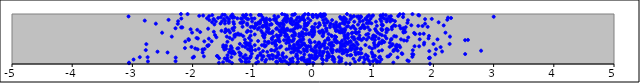
| Category | points |
|---|---|
| 0.28631237360216133 | 0.413 |
| -0.5709670232004376 | 0.495 |
| -2.3455216637890155 | 0.548 |
| -0.5499828507902489 | 0.104 |
| 0.6344324026478905 | 0.179 |
| 1.135706288979729 | 0.852 |
| 1.4372722017462278 | 0.762 |
| -0.4767321881819129 | 0.632 |
| -0.42278632323329113 | 0.451 |
| 1.30479831486943 | 0.502 |
| -0.5423704332218904 | 0.638 |
| -1.0743103809468266 | 0.895 |
| 0.9093813845658696 | 0.735 |
| 0.4461499582376689 | 0.796 |
| 0.3174532839278532 | 0.877 |
| 0.18317735786781153 | 0.365 |
| 0.06883051844332666 | 0.38 |
| 0.700314994260216 | 0.235 |
| -1.8058682499574052 | 0.453 |
| -0.1724643142331237 | 0.937 |
| -0.06916244388780779 | 0.026 |
| -0.5365765248501049 | 0.066 |
| -0.22979342127274993 | 0.601 |
| 0.19696704255364672 | 0.459 |
| 1.4420515253011414 | 0.995 |
| -1.4656345420582095 | 0.981 |
| 1.0607852612586992 | 0.764 |
| -0.3173891089680838 | 0.636 |
| 0.447472624164412 | 0.07 |
| -1.0947298749557612 | 0.81 |
| -1.0140542113659192 | 0.279 |
| -0.638083960201242 | 0.266 |
| 1.6577859305472735 | 0.275 |
| -0.3681614701345337 | 0.816 |
| 0.2915248789625249 | 0.38 |
| -1.0613637014224135 | 0.41 |
| -1.6135907318958669 | 0.85 |
| -1.3093623990409373 | 0.211 |
| 1.5013714261222342 | 0.651 |
| -0.9185939609505382 | 0.696 |
| -1.2104163992287207 | 0.172 |
| 2.5283634539804094 | 0.199 |
| -1.0524070766473645 | 0.408 |
| 1.0002923353349606 | 0.556 |
| -0.3014528794329543 | 0.708 |
| -0.16595293698929137 | 0.922 |
| 0.6650741115798908 | 0.758 |
| 1.28651173208838 | 0.192 |
| -0.9685784449776893 | 0.377 |
| -0.7378115214331746 | 0.707 |
| -0.20033730462058585 | 0.58 |
| 0.40974114238819936 | 0.67 |
| -0.6597229061424814 | 0.548 |
| -1.4427862025825364 | 0.305 |
| -0.13526549446516967 | 0.81 |
| 0.47180004164708667 | 0.108 |
| -0.045270741931597414 | 0.349 |
| 1.1481751497962644 | 0.686 |
| 0.5280723621406853 | 0.915 |
| -0.2060441158924311 | 0.347 |
| -1.3171111232605828 | 0.234 |
| -0.9244083371875433 | 0.796 |
| -0.3823866680530488 | 0.361 |
| -1.3502675074652828 | 0.322 |
| 0.827576718456271 | 0.863 |
| 0.6854094799217707 | 0.491 |
| -0.5136678156327177 | 0.998 |
| 1.8390853826058429 | 0.605 |
| -2.8773133847457757 | 0.137 |
| 1.2473095647619088 | 0.687 |
| 0.10240273423950352 | 0.423 |
| -1.3926207020137173 | 0.238 |
| 1.4614444659623516 | 0.493 |
| 0.25807453091606636 | 0.601 |
| -0.8372305807208802 | 0.758 |
| -0.8281933356508944 | 0.752 |
| -2.794580890276049 | 0.868 |
| -0.13900485390203254 | 0.767 |
| 0.783415549932899 | 0.942 |
| -0.18273974006321048 | 0.637 |
| -0.346224884974597 | 0.566 |
| -0.07964475199217347 | 0.816 |
| 0.4914757870452515 | 0.689 |
| 1.649374466103728 | 0.199 |
| -0.9671200633866457 | 0.591 |
| -1.4280327907212795 | 0.931 |
| -0.9631924948197206 | 0.744 |
| -1.584802740413652 | 0.155 |
| 3.001768790963995 | 0.945 |
| -1.5360781472547957 | 0.81 |
| -0.9544577010922701 | 0.811 |
| -1.5581121113269916 | 0.116 |
| 0.6883966439386597 | 0.498 |
| -0.10186170962075725 | 0.778 |
| -0.5713076849667127 | 0.191 |
| 0.833925490452053 | 0.782 |
| 1.5327451708922117 | 0.641 |
| -2.284270209862583 | 0.715 |
| -0.3132790501727847 | 0.386 |
| -3.055993340217732 | 0.026 |
| -0.026014965633065934 | 0.648 |
| -0.44283979954539365 | 0.419 |
| -0.23881592092844173 | 0.341 |
| -0.6139196445807933 | 0.854 |
| 0.9113013311058253 | 0.152 |
| 0.1959636397571094 | 0.769 |
| -2.7683834535698306 | 0.397 |
| 1.158320062868512 | 0.769 |
| 0.9319616235447512 | 0.062 |
| -0.25064880169868164 | 0.777 |
| -0.8298473386451448 | 0.257 |
| -1.0373644174137961 | 0.565 |
| 0.38125053152281474 | 0.66 |
| 0.36822699099341527 | 0.446 |
| 0.45467639047289143 | 0.631 |
| -1.1171292754346096 | 0.416 |
| -0.254991188271104 | 0.726 |
| 0.5074935426260261 | 0.407 |
| -0.6047053249857948 | 0.304 |
| 0.2025968549814463 | 0.309 |
| -0.18818910459752214 | 0.111 |
| -2.1712136349292583 | 0.733 |
| -0.10881605551854356 | 0.77 |
| -1.8331795761894725 | 0.23 |
| -0.055845184771494694 | 0.054 |
| -0.8136604030634356 | 0.383 |
| -2.5827312670867975 | 0.246 |
| -0.6014156195161053 | 0.823 |
| 0.890498851229772 | 0.816 |
| 0.9176585795064742 | 0.603 |
| 1.4163063164377565 | 0.959 |
| 0.4910942369720459 | 0.267 |
| 0.534032341111911 | 0.684 |
| -0.8498209591245818 | 0.376 |
| -1.022243545271082 | 0.332 |
| 1.819074424757119 | 0.759 |
| -0.44905680283906246 | 0.846 |
| 0.06282551770594758 | 0.146 |
| -0.33372817681970535 | 0.56 |
| 0.2841898879890339 | 0.736 |
| -0.16116325533000175 | 0.493 |
| -1.3783475916697485 | 0.63 |
| -0.48255971421439003 | 0.676 |
| 1.666885294946626 | 0.19 |
| 1.223352967142021 | 0.849 |
| 0.39536076353366223 | 0.427 |
| -0.214246253179045 | 0.48 |
| 1.5193403580270024 | 0.685 |
| 0.35426109291032226 | 0.095 |
| -0.49510940768877454 | 0.866 |
| 0.13009788510700293 | 0.342 |
| -0.6022129149119477 | 0.717 |
| 0.5816129568028678 | 0.517 |
| -0.004355514641864566 | 0.652 |
| -1.2572905455128387 | 0.309 |
| -0.24529664574777854 | 0.446 |
| 1.0625892519119784 | 0.032 |
| -0.8105559740982731 | 0.54 |
| 2.791789605335289 | 0.266 |
| -0.6112121678142817 | 0.46 |
| 0.58359937561519 | 0.268 |
| -1.066085860212743 | 0.373 |
| -0.1132113498187639 | 0.357 |
| -1.4531315827806255 | 0.347 |
| 1.0736669701711232 | 0.625 |
| -2.127301444714845 | 0.318 |
| -0.5750587598583365 | 0.512 |
| -1.3193038765241756 | 0.673 |
| 0.8628779148367833 | 0.087 |
| -1.873689761123762 | 0.639 |
| 1.9427425975114954 | 0.005 |
| 0.28278404833308635 | 0.772 |
| 0.09114233559514862 | 0.964 |
| -0.6776628486168077 | 0.417 |
| 1.1694065488313639 | 0.451 |
| 0.2623287522462485 | 0.486 |
| 0.2396981247990464 | 0.236 |
| 0.65632640850703 | 0.317 |
| -0.509432843419769 | 0.171 |
| 1.9722331279038476 | 0.902 |
| -1.604946100021226 | 0.535 |
| -0.6690230244893609 | 0.651 |
| -1.5634019972580617 | 0.024 |
| 0.676883195285626 | 0.377 |
| 0.15621033467665058 | 0.972 |
| 0.9258261179296383 | 0.818 |
| 0.8284131488541231 | 0.762 |
| 1.3057640147110172 | 0.369 |
| -0.8312361935550197 | 0.567 |
| -0.40792683965000087 | 0.485 |
| 0.0375187267795285 | 0.803 |
| 0.5787725006376405 | 0.404 |
| -0.14083327196879925 | 0.876 |
| 0.5263252581691802 | 0.579 |
| 0.402731034050686 | 0.446 |
| 0.004261547775881169 | 0.262 |
| 0.1578162587894072 | 0.974 |
| 1.0219721068639211 | 0.381 |
| 0.6419607279943689 | 0.616 |
| 0.018378548775983994 | 0.628 |
| -0.7748696374755264 | 0.871 |
| 0.8423940961458616 | 0.027 |
| -2.061200208596601 | 0.481 |
| -0.12516790556005386 | 0.598 |
| -1.9340497753061587 | 0.521 |
| -0.8971336368484533 | 0.979 |
| -2.068029504007132 | 0.498 |
| 0.98847511820113 | 0.194 |
| -0.8736513864199784 | 0.216 |
| 0.43109505488992994 | 0.135 |
| 0.14535947702331242 | 0.941 |
| -0.34835845164455925 | 0.311 |
| -0.8357606128194748 | 0.932 |
| 0.11278463866858246 | 0.78 |
| -0.43620746595386173 | 0.848 |
| -1.3553421974142879 | 0.139 |
| -0.2502480303630197 | 0.043 |
| -1.1704117173995332 | 0.745 |
| 0.06834471916642659 | 0.148 |
| -1.3620574064284714 | 0.226 |
| -0.46861322610025535 | 0.905 |
| 0.05007533915311235 | 0.98 |
| -0.12779374363962148 | 0.701 |
| -0.6321328984466819 | 0.899 |
| -1.0319072811139858 | 0.651 |
| -0.3746523367788628 | 0.832 |
| 0.7851005180602009 | 0.212 |
| -0.7339076317224631 | 0.624 |
| 0.5411884253240133 | 0.522 |
| 1.1547194575676514 | 0.783 |
| 0.4894580778647004 | 0.629 |
| 1.164357419516632 | 0.987 |
| -0.41966949920777274 | 0.91 |
| -1.3791252037594655 | 0.29 |
| 0.021346387678622847 | 0.645 |
| -1.1620196342410978 | 0.137 |
| -0.44019847661373834 | 0.294 |
| -1.8361426774921243 | 0.291 |
| 0.8058050486637178 | 0.477 |
| -1.4728753927524947 | 0.289 |
| -0.2027367161335203 | 0.231 |
| -1.4615456418629575 | 0.637 |
| 1.3360453195106254 | 0.259 |
| 0.43482715054916365 | 0.035 |
| 0.728898152056046 | 0.32 |
| -1.0370010144026978 | 0.74 |
| 0.9040213347936348 | 0.106 |
| -1.0070560105136206 | 0.748 |
| 1.1854065742702895 | 0.907 |
| -1.389015204092587 | 0.054 |
| -0.06325880042214926 | 0.595 |
| -0.7693129112122579 | 0.648 |
| -0.8812384707899836 | 0.81 |
| -1.1525198214496157 | 0.841 |
| -1.4305576678747585 | 0.1 |
| -1.130567962184581 | 0.932 |
| 1.2190825267579983 | 0.634 |
| 0.3633789925427946 | 0.555 |
| 0.34020136916582544 | 0.13 |
| -1.463332083400143 | 0.811 |
| 1.3872488154649494 | 0.33 |
| -0.8670967217569965 | 0.871 |
| 0.9801310343893244 | 0.953 |
| -0.5096618785204798 | 0.05 |
| 0.6493301640077798 | 0.933 |
| -0.012759899399733321 | 0.975 |
| -0.6212457131848286 | 0.36 |
| 1.5678019472052913 | 0.072 |
| 0.16328360637596173 | 0.238 |
| 2.2422271162922893 | 0.926 |
| -1.258747883679587 | 0.592 |
| 1.861924247803345 | 0.897 |
| -0.08549589323840312 | 0.815 |
| -1.319279022232184 | 0.94 |
| 0.7427133301706599 | 0.391 |
| -0.06691371071583951 | 0.078 |
| -0.22824384243352558 | 0.933 |
| 0.10197771542425649 | 0.416 |
| 0.7946210133311871 | 0.952 |
| -0.9749520610376523 | 0.72 |
| -0.7156591095137621 | 0.11 |
| -1.423100966429689 | 0.122 |
| 0.9379116200174797 | 0.335 |
| -0.07429976347279066 | 0.355 |
| 0.5699192435396787 | 0.177 |
| -0.9346931171327695 | 0.12 |
| 0.6557976637737362 | 0.624 |
| 0.06855100923734891 | 0.931 |
| 1.294030501499309 | 0.483 |
| -0.40384721150335334 | 0.005 |
| -1.6451121789338572 | 0.889 |
| -0.8304672414838059 | 0.899 |
| -0.45060245762720186 | 0.875 |
| 0.5015357595644074 | 0.279 |
| -1.0922878816460733 | 0.783 |
| 1.2866440533697467 | 0.897 |
| -0.9716325949332036 | 0.911 |
| -0.34348697176845455 | 0.982 |
| -0.7414989538019823 | 0.418 |
| -0.15768320761441856 | 0.133 |
| 1.310135653325342 | 0.696 |
| -1.574994961874939 | 0.921 |
| -1.955577782606488 | 0.31 |
| 1.2355307230187123 | 0.888 |
| -0.5596464153152585 | 0.783 |
| -0.4113038048071891 | 0.479 |
| -1.440833773394326 | 0.661 |
| 0.03405481684917788 | 0.329 |
| -0.335042108131141 | 0.683 |
| -0.5386702659912128 | 0.082 |
| -0.9105602691948276 | 0.044 |
| -1.3127890316123976 | 0.801 |
| 1.4745147504387681 | 0.214 |
| 0.9708191346079813 | 0.813 |
| 0.2515823988471544 | 0.518 |
| -1.8245860191527958 | 0.969 |
| -1.2253046485449008 | 0.232 |
| 0.48871317332888164 | 0.212 |
| -0.6411759606394156 | 0.96 |
| -0.7272969067672133 | 0.165 |
| -1.1041835111651235 | 0.422 |
| 0.29122032516372265 | 0.809 |
| -0.9114592408244953 | 0.46 |
| 0.8712414496628966 | 0.379 |
| 1.9319517847529522 | 0.258 |
| 1.1050969458178983 | 0.428 |
| 1.847367631964259 | 0.426 |
| -0.21018292460315813 | 0.555 |
| 0.5534804886400124 | 0.421 |
| -0.5429426939896524 | 0.752 |
| -0.0022581675472324036 | 0.982 |
| -1.3211345546992224 | 0.84 |
| -0.28879886470828886 | 0.731 |
| 0.05528646353333144 | 0.118 |
| -0.839056478829467 | 0.744 |
| 0.3123999740238368 | 0.427 |
| 0.02441207640253129 | 0.125 |
| 1.1961390056824968 | 0.557 |
| -1.6729887441386806 | 0.977 |
| -0.04346636002842974 | 0.87 |
| 2.200465884316337 | 0.626 |
| -0.5942447937720576 | 0.041 |
| 0.04518100873801245 | 0.351 |
| 0.12445538503074793 | 0.996 |
| -0.2092668358242955 | 0.743 |
| -0.7752038330453095 | 0.909 |
| -1.3349581651299864 | 0.259 |
| 0.7525822452276554 | 0.207 |
| 1.5823067464527893 | 0.532 |
| -0.7788829389193133 | 0.085 |
| -0.5629816961988006 | 0.672 |
| 1.842620633737555 | 0.391 |
| -0.5837359919381342 | 0.231 |
| 0.5052368681279908 | 0.879 |
| 0.2250522912918278 | 0.66 |
| -0.30633109224450816 | 0.271 |
| -0.4359037341451497 | 0.032 |
| -1.652031630538911 | 0.898 |
| 0.6764909475055045 | 0.537 |
| -0.7597160823033908 | 0.243 |
| -0.3201918783336488 | 0.849 |
| 1.5040400644369472 | 0.629 |
| 1.4319929512674374 | 0.369 |
| -1.5955148722150776 | 0.161 |
| -1.19642000471781 | 0.909 |
| -0.013823709388802286 | 0.122 |
| -1.3388331996485485 | 0.709 |
| 0.9316616731620275 | 0.857 |
| -0.5362978532119786 | 0.062 |
| -0.29080528460113175 | 0.789 |
| -0.26351435585905847 | 0.394 |
| 0.0031078526155914332 | 0.02 |
| -1.0513709642267441 | 0.302 |
| -0.5914191250502796 | 0.162 |
| -0.8114615746783702 | 0.592 |
| 0.2709977095093823 | 0.157 |
| -1.2112030919769836 | 0.089 |
| -0.14617477180654426 | 0.389 |
| 0.7625048784272481 | 0.221 |
| -0.7742467472976822 | 0.815 |
| 1.0126711053887787 | 0.423 |
| 1.0338130912205834 | 0.089 |
| 0.891444433009263 | 0.489 |
| -0.16696248908174383 | 0.548 |
| 0.018147746539966647 | 0.11 |
| -1.9969589387792146 | 0.127 |
| 1.0276965047780546 | 0.478 |
| 0.5643358453744902 | 0.998 |
| 1.1126856473790783 | 0.146 |
| 0.3370540794062391 | 0.37 |
| -1.0925241890004358 | 0.111 |
| 0.041609088659257054 | 0.212 |
| -1.7264149415314822 | 0.956 |
| 0.7218758279930535 | 0.613 |
| -0.11415946073422756 | 0.039 |
| 1.499319322877767 | 0.995 |
| 0.17417233000779753 | 0.372 |
| 1.0398171803733947 | 0.551 |
| -1.7481887771511584 | 0.36 |
| -0.3167834583927176 | 0.503 |
| 1.496200597882007 | 0.937 |
| 0.14982154132451342 | 0.161 |
| -1.0847049113177079 | 0.665 |
| -1.0980887386598077 | 0.904 |
| 1.5771890964408772 | 0.874 |
| 0.03567516302372287 | 0.1 |
| 0.10730020748408897 | 0.221 |
| -0.6809227072278183 | 0.49 |
| -0.2026585362180917 | 0.474 |
| -0.2982771251573819 | 0.61 |
| -0.05915289374979338 | 0.173 |
| -1.502318809029342 | 0.985 |
| -0.4652226599930769 | 0.907 |
| 0.24001362202974885 | 0.494 |
| 1.374567572938548 | 0.292 |
| 0.30410493333002275 | 0.281 |
| -0.8669791048221951 | 0.183 |
| 0.5611056635541125 | 0.746 |
| -0.07814527594865872 | 0.99 |
| 1.0471386372692537 | 0.666 |
| 1.1844582159863943 | 0.438 |
| 0.468132467757445 | 0.684 |
| 0.9974446793036842 | 0.971 |
| 0.26240599568146106 | 0.14 |
| 0.5611114559866035 | 0.249 |
| -3.0640699303110557 | 0.951 |
| 1.406886564168885 | 0.267 |
| 0.5261648315911112 | 0.504 |
| -0.9058328077081148 | 0.831 |
| 0.8842695532928095 | 0.587 |
| 1.4477898085108372 | 0.335 |
| -0.1827484250591489 | 0.899 |
| -0.037585463206830205 | 0.425 |
| 1.9268873684672236 | 0.562 |
| -0.2539332037752562 | 0.269 |
| 0.32963119773844696 | 0.284 |
| -0.05942069866079169 | 0.021 |
| 2.119558081370961 | 0.338 |
| 0.035049424088986925 | 0.177 |
| 0.9297565219035411 | 0.972 |
| -2.194278807644647 | 0.999 |
| -1.4902414562204038 | 0.374 |
| -0.7351722123942857 | 0.443 |
| -0.8603143520611978 | 0.664 |
| 2.2697535455179843 | 0.401 |
| 0.3236456476717189 | 0.15 |
| 0.30735568425435655 | 0.349 |
| -0.26397187154345225 | 0.165 |
| 0.7570396854863048 | 0.953 |
| 0.2108709638367543 | 0.9 |
| 0.773465781279473 | 0.57 |
| 2.029233450649194 | 0.195 |
| -1.162403200365823 | 0.974 |
| 0.16340127338092714 | 0.556 |
| -0.5540416362318812 | 0.449 |
| -0.37999810690265345 | 0.092 |
| -0.5772096659577786 | 0.949 |
| 1.138589382752226 | 0.415 |
| -1.22638413887835 | 0.586 |
| -0.2580011670085476 | 0.929 |
| -0.3626249237439305 | 0.672 |
| 1.2763740473195773 | 0.425 |
| -0.5219424797281604 | 0.634 |
| -0.5853567659529233 | 0.813 |
| 2.2751960044793176 | 0.548 |
| -0.31084443049243493 | 0.305 |
| 0.11052559370536752 | 0.18 |
| 0.1260973289099363 | 0.966 |
| -0.1904189940274783 | 0.089 |
| -1.040455720819362 | 0.263 |
| -2.4158157109792358 | 0.23 |
| 1.3807612613429834 | 0.55 |
| 0.7931777913389588 | 0.305 |
| -0.49539633043247644 | 0.709 |
| -1.677321262776383 | 0.836 |
| 1.3693800619963605 | 0.762 |
| -0.1521036323349918 | 0.705 |
| -1.4590063019068031 | 0.867 |
| -0.5289712433042109 | 0.353 |
| 1.0939407972303519 | 0.257 |
| 0.7687115503339887 | 0.504 |
| -1.1215849773852593 | 0.177 |
| 1.0878566934003597 | 0.393 |
| -0.3782057426002794 | 0.668 |
| 0.685967881553359 | 0.845 |
| 1.5577060051456861 | 0.468 |
| 1.1228114585709852 | 0.972 |
| 0.26054193349852817 | 0.198 |
| 0.7643320740582258 | 0.081 |
| -0.4918919816361802 | 0.129 |
| 2.1709373693043155 | 0.772 |
| -0.5417119211253167 | 0.662 |
| -0.23167966062720602 | 0.553 |
| -0.7720845486333356 | 0.751 |
| -0.1459369357765734 | 0.875 |
| -0.05675609981895313 | 0.475 |
| -0.4603818388889058 | 0.573 |
| -0.023607478101525636 | 0.169 |
| -1.095909452597871 | 0.385 |
| -0.43952407153997974 | 0.952 |
| -0.5511190494973146 | 0.33 |
| -0.3276044332367869 | 0.471 |
| -0.400569306307645 | 0.424 |
| 0.840376973248973 | 0.512 |
| -1.6384024884724502 | 0.791 |
| 1.3495838630103716 | 0.558 |
| 1.2266315779297479 | 0.898 |
| -0.7998644336677012 | 0.451 |
| -0.06953249848598553 | 0.612 |
| -0.9009604130529558 | 0.305 |
| 2.293622625466071 | 0.92 |
| 0.5434807559356303 | 0.286 |
| 1.8611907482730325 | 0.806 |
| -1.3008515908663547 | 0.545 |
| 1.128468144099684 | 0.954 |
| 2.2314542841386587 | 0.884 |
| -0.6621018137211321 | 0.17 |
| -0.4724760369794234 | 0.066 |
| -1.492037873716459 | 0.338 |
| -1.7419124625433442 | 0.706 |
| 0.5922233323097519 | 0.834 |
| 0.8044889062444502 | 0.215 |
| -0.7833509399529959 | 0.37 |
| -1.7304068382667923 | 0.506 |
| 1.0458878547901493 | 0.846 |
| 1.4578567948465118 | 0.712 |
| -0.4437926997517412 | 0.139 |
| -1.3437864834867845 | 0.218 |
| -0.01652242804233861 | 0.292 |
| 0.1717905970897755 | 0.609 |
| -1.2882778017231535 | 0.592 |
| 0.018865051530918997 | 0.671 |
| 0.3784527320453508 | 0.453 |
| -0.3081325589572481 | 0.331 |
| 1.31996037051037 | 0.879 |
| -0.4271330172154375 | 0.706 |
| -1.1285692344782117 | 0.422 |
| -0.19209116241762914 | 0.435 |
| -1.3940975133709275 | 0.896 |
| 1.0270041783182604 | 0.331 |
| -0.9451788349338752 | 0.783 |
| -1.1831378020116814 | 0.823 |
| -2.2459667810693116 | 0.803 |
| -0.3215057633434979 | 0.983 |
| 1.4993842051663755 | 0.715 |
| 1.7634625029352655 | 0.354 |
| 0.6906388378747854 | 0.36 |
| 0.4034942174070917 | 0.277 |
| -1.8895499514163836 | 0.963 |
| 1.090954731095354 | 0.51 |
| 0.22543359006013564 | 0.074 |
| 0.3120646257478432 | 0.259 |
| -0.5003167265784771 | 0.214 |
| 0.6642612441404694 | 0.385 |
| -1.3857215686509834 | 0.524 |
| -0.10292907718254707 | 0.009 |
| 0.9889435524347565 | 0.51 |
| 0.14635675348510802 | 0.109 |
| 1.0981838106446826 | 0.13 |
| 0.6251702335794542 | 0.364 |
| 1.650456433121927 | 0.144 |
| 0.3419078901664143 | 0.789 |
| -0.4629391844155313 | 0.617 |
| 0.3635131340986506 | 0.508 |
| 0.1961915255878104 | 0.417 |
| -0.8157585892614341 | 0.766 |
| -1.5200596783670601 | 0.664 |
| -0.6172022467568636 | 0.387 |
| 0.5469134336751198 | 0.845 |
| -0.09136409496560027 | 0.083 |
| 0.24011398215957946 | 0.322 |
| -0.3595801126627869 | 0.055 |
| -1.8121999502373578 | 0.153 |
| 1.0048075072158857 | 0.572 |
| -0.4077640519682273 | 0.532 |
| 0.3843036425800319 | 0.832 |
| 0.5916144319111947 | 0.439 |
| -0.6116202337301422 | 0.045 |
| -0.4338793270884036 | 0.969 |
| -0.10782070955236023 | 0.678 |
| 0.3917829363420866 | 0.261 |
| 1.9047071380988942 | 0.743 |
| 0.5243515445358504 | 0.798 |
| -2.7469943057779114 | 0.137 |
| -3.0563352850253334 | 0.017 |
| 1.0334378778571702 | 0.542 |
| -1.9120399124024416 | 0.51 |
| -0.31905432806217693 | 0.364 |
| 1.9396697605685107 | 0.127 |
| 0.7867345133475796 | 0.128 |
| -0.707277079157298 | 0.618 |
| -0.1444346889470376 | 0.192 |
| -0.26153852823300827 | 0.821 |
| 0.05321835856784407 | 0.227 |
| 0.5236665611905185 | 0.64 |
| -0.6207379013429319 | 0.382 |
| 1.0331689835162798 | 0.698 |
| 0.7722001929682802 | 0.512 |
| 0.7473976772228141 | 0.788 |
| -0.6053938144618876 | 0.575 |
| 1.6334479988905413 | 0.774 |
| -0.3628427740809803 | 0.909 |
| 1.5900120211230702 | 0.057 |
| -2.7776806538199255 | 0.278 |
| -0.6133498930813115 | 0.904 |
| 1.6989857173519525 | 0.598 |
| 0.04187473428748412 | 0.121 |
| 2.57413316001127 | 0.482 |
| 0.42995958306238524 | 0.754 |
| -0.36288461913788783 | 0.232 |
| -0.3856643807701827 | 0.472 |
| -0.5146236060682554 | 0.706 |
| -1.1256136653971227 | 0.341 |
| 0.2196713123498606 | 0.708 |
| -1.5128562119349356 | 0.85 |
| 0.22393564212526584 | 0.707 |
| -1.1877971380540249 | 0.052 |
| -1.0290067524964632 | 0.469 |
| -0.5998541750950812 | 0.131 |
| 0.16063591815348843 | 0.565 |
| 0.9021626346453235 | 0.949 |
| -0.8790508584138452 | 0.835 |
| 0.19678004067621568 | 0.993 |
| -0.7128390545025924 | 0.879 |
| 0.10056319368346323 | 0.425 |
| 2.002058211459257 | 0.4 |
| -0.956743060781112 | 0.279 |
| -1.1247214017758873 | 0.044 |
| 1.5690388374973372 | 0.822 |
| -0.16321385246062192 | 0.609 |
| -2.610431500507133 | 0.806 |
| 0.5861582126630065 | 0.83 |
| -1.916172220245957 | 0.294 |
| -2.2829398423049234 | 0.056 |
| 0.10287738074082764 | 0.327 |
| 0.17035126515488486 | 0.878 |
| -0.43915306446802393 | 0.486 |
| 0.694830371552035 | 0.29 |
| -1.36286970823119 | 0.354 |
| -0.3256887784472404 | 0.241 |
| 1.1107774701770996 | 0.595 |
| 2.526655635752711 | 0.476 |
| -0.27434054260153573 | 0.195 |
| 0.23612956052301382 | 0.162 |
| 0.7927798917907039 | 0.292 |
| 0.17800635247472663 | 0.632 |
| 0.8699885836533445 | 0.907 |
| -1.73283039549871 | 0.378 |
| -0.25805110841338497 | 0.796 |
| 0.22976905428883487 | 0.827 |
| 1.6873421432735691 | 0.356 |
| -0.22634813805732978 | 0.857 |
| -1.1097558169970485 | 0.985 |
| -1.1182073401318338 | 0.974 |
| -0.23511482567186182 | 0.322 |
| -0.6827969564237879 | 0.178 |
| 0.3003926019708727 | 0.4 |
| 0.806807009991962 | 0.726 |
| 0.720765675217125 | 0.435 |
| -0.4702158522539941 | 0.984 |
| 1.3905905145578243 | 0.384 |
| -2.506597976606619 | 0.626 |
| 1.3424412358791642 | 0.282 |
| -1.0353966301867024 | 0.155 |
| -1.1229331108424816 | 0.103 |
| -0.5045802643537085 | 0.818 |
| -0.5651951664010255 | 0.551 |
| 0.3578146270890432 | 0.484 |
| 1.763644595686384 | 0.972 |
| -0.8013233368957637 | 0.351 |
| -0.12473125876029556 | 0.806 |
| 0.38856098668680694 | 0.782 |
| 0.7250517831583663 | 0.303 |
| -0.14457453344924875 | 0.26 |
| 0.8917626633073095 | 0.882 |
| 0.77933327001353 | 0.848 |
| -0.7934490727422672 | 0.046 |
| -1.9216755428230767 | 0.683 |
| 0.32142027983127885 | 0.229 |
| -0.3467323469010912 | 0.454 |
| 1.3617025716071023 | 0.856 |
| 0.029430414486836476 | 0.44 |
| -0.29566639235764214 | 0.573 |
| -1.4671548358511854 | 0.111 |
| 0.39157891331671113 | 0.743 |
| -0.10151558457324672 | 0.348 |
| 0.30279411440513826 | 0.571 |
| -0.4932521249852426 | 0.731 |
| -0.39898739919668813 | 0.306 |
| 0.7827759279777338 | 0.71 |
| -0.6958227395826313 | 0.277 |
| -2.741814120108352 | 0.051 |
| -0.0763753594735661 | 0.997 |
| -0.8633981102462167 | 0.979 |
| -1.0114421351800376 | 0.851 |
| 0.7047696694652306 | 0.635 |
| 0.4603952550479562 | 0.651 |
| 0.8559315467601518 | 0.714 |
| 0.463569000762444 | 0.355 |
| -2.240714409109859 | 0.854 |
| -1.0613696703111666 | 0.519 |
| -1.1801739982171053 | 0.901 |
| -0.45524884038698765 | 0.569 |
| 0.9950192861585698 | 0.055 |
| 1.7501458774595076 | 0.978 |
| -1.42167737354242 | 0.444 |
| -0.33776235021780643 | 0.112 |
| -1.1044150400084698 | 0.039 |
| -0.6438336289910778 | 0.424 |
| -0.8101396843494948 | 0.526 |
| -0.6871718579862165 | 0.511 |
| -1.049819986497142 | 0.369 |
| -0.3396083837575734 | 0.79 |
| 0.510065963537409 | 0.835 |
| -0.7385339156083628 | 0.691 |
| 0.5763163941874279 | 0.569 |
| -1.256571905224991 | 0.913 |
| 0.7063954407055464 | 0.697 |
| -0.6259469139846239 | 0.459 |
| 0.6168740357325886 | 0.172 |
| -0.6510189817488223 | 0.891 |
| 0.5724558426278064 | 0.255 |
| 0.5165067853798897 | 0.226 |
| -0.11058898199155909 | 0.598 |
| -1.7542972399504357 | 0.366 |
| -1.7218288679709648 | 0.879 |
| -0.6895502546941259 | 0.793 |
| 1.273495960245545 | 0.343 |
| -0.9432256429829806 | 0.017 |
| 0.4815410954279997 | 0.465 |
| -1.802051401473273 | 0.3 |
| -0.7580622848913263 | 0.723 |
| 1.1358776047759322 | 0.7 |
| -0.09991512598837815 | 0.255 |
| -0.1492044741367602 | 0.412 |
| -1.4939659890737058 | 0.034 |
| 0.3476805272559913 | 0.744 |
| 0.45465583944409804 | 0.314 |
| -1.1963810843379044 | 0.587 |
| 0.11474375573746354 | 0.625 |
| 0.9559403046391601 | 0.906 |
| -0.18306001799539295 | 0.377 |
| -1.1318891497984946 | 0.487 |
| -0.1621377303021676 | 0.966 |
| -0.05060764508079618 | 0.444 |
| -1.016308522127682 | 0.208 |
| -1.647113517919112 | 0.645 |
| -0.2599727783642063 | 0.424 |
| 1.0677644908896022 | 0.055 |
| -1.033908944648517 | 0.353 |
| 0.18353740997166845 | 0.822 |
| 0.10343117228978826 | 0.817 |
| 0.6211273277038849 | 0.895 |
| 0.31512611716804173 | 0.555 |
| -2.980501921052517 | 0.089 |
| 0.1450659097840754 | 0.662 |
| 1.146588693611851 | 0.274 |
| -0.014551690961752684 | 0.581 |
| -0.4814268497370424 | 0.475 |
| -1.215072744276993 | 0.403 |
| -0.14292016868708135 | 0.06 |
| 1.4832349547474273 | 0.2 |
| -2.3994528737669687 | 0.883 |
| 0.53203057983084 | 0.36 |
| -1.0176794449342035 | 0.912 |
| 1.3230232952932486 | 0.396 |
| -0.6100657733168173 | 0.703 |
| -1.3083526212394618 | 0.932 |
| 0.6988048893235064 | 0.045 |
| 0.4865492841332104 | 0.894 |
| 1.027648677748469 | 0.163 |
| -1.684549759371266 | 0.454 |
| 0.15647820163305592 | 0.672 |
| -0.4343267925342431 | 0.582 |
| -0.3673623435458433 | 0.856 |
| -1.200246974506812 | 0.204 |
| 0.17813108720030257 | 0.245 |
| -1.3406561529908494 | 0.493 |
| -0.8388338438314369 | 0.621 |
| -0.04811661238388609 | 0.12 |
| -0.7976914224811829 | 0.838 |
| 1.1437687901517437 | 0.576 |
| -0.13652724227778634 | 0.273 |
| 0.5508295141663639 | 0.891 |
| 0.8581284422649214 | 0.727 |
| -0.8231350169540903 | 0.157 |
| -0.015146011973737217 | 0.685 |
| 0.7686441690019059 | 0.901 |
| -1.346032364968904 | 0.018 |
| 0.6716942956314602 | 0.104 |
| -0.013402851073077038 | 0.74 |
| -0.7187308335380775 | 0.782 |
| 1.2943305205066302 | 0.955 |
| -0.2493242787774248 | 0.105 |
| -1.3984145033291435 | 0.852 |
| -0.29970820885925775 | 0.996 |
| 0.6277772402401354 | 0.432 |
| 0.9785859093654139 | 0.505 |
| 1.7488594680250706 | 0.763 |
| 0.08149373311231134 | 0.738 |
| 1.7733504222820917 | 0.601 |
| -1.3054473820965526 | 0.733 |
| 0.4838168279398767 | 0.283 |
| 0.45065207382509964 | 0.941 |
| 1.9304027331993954 | 0.116 |
| 0.8773066880342268 | 0.185 |
| 0.46238486411041624 | 0.909 |
| 1.1408133659777393 | 0.787 |
| -0.24159609522894598 | 0.253 |
| -1.3634636187656026 | 0.954 |
| -0.5977105011774322 | 0.028 |
| 0.9251557578155314 | 0.534 |
| -0.3840645414125037 | 0.871 |
| 0.12728685390923467 | 0.36 |
| -1.4811453901493703 | 0.901 |
| -1.0834937193598195 | 0.3 |
| 0.7104593821146468 | 0.191 |
| 0.9488063881498432 | 0.005 |
| 1.652163021648028 | 0.997 |
| -0.15468060752999158 | 0.297 |
| -1.2458077226536695 | 0.608 |
| -1.0469307425694172 | 0.12 |
| -1.4498824518349505 | 0.694 |
| -1.1577175029398274 | 0.557 |
| 0.5476526763355221 | 0.011 |
| 0.19643712094343435 | 0.979 |
| 0.841484483658606 | 0.132 |
| -0.45346140436549565 | 0.678 |
| -0.7972135644243323 | 0.588 |
| 0.3258617775750894 | 0.089 |
| 0.16007308223497851 | 0.014 |
| -0.8377550133186107 | 0.139 |
| -0.1022246427235114 | 0.3 |
| 1.1066715087985903 | 0.041 |
| -1.9766105071546907 | 0.145 |
| -0.6928892502979425 | 0.798 |
| 0.9411641674749527 | 0.681 |
| 0.6499913317369099 | 0.539 |
| 0.3544502812357857 | 0.045 |
| 1.1598198769044457 | 0.928 |
| 1.146026747627439 | 0.676 |
| 0.9971711391045179 | 0.142 |
| 0.24434885688435415 | 0.854 |
| 1.1356652418701954 | 0.092 |
| 1.2200701028366048 | 0.512 |
| 0.018988602755412032 | 0.732 |
| -1.7607326423770546 | 0.913 |
| -0.668901886859949 | 0.105 |
| 0.010487319844287413 | 0.705 |
| -0.14120046719714008 | 0.082 |
| -1.3046521325390295 | 0.579 |
| -0.3332724339846891 | 0.045 |
| 1.117380356094528 | 0.895 |
| -1.1411645882676495 | 0.956 |
| -0.276481245830297 | 0.312 |
| 0.38086058112690147 | 0.468 |
| 0.17674704179467593 | 0.954 |
| 1.2827596492611475 | 0.851 |
| -0.20615134633559418 | 0.892 |
| -1.4288817188371077 | 0.069 |
| -0.4867793941930305 | 0.781 |
| -0.7649898491876854 | 0.71 |
| -1.2070922179228933 | 0.824 |
| 1.3735199671559188 | 0.357 |
| 1.259424349815463 | 0.153 |
| 1.680525564679182 | 0.622 |
| 0.013309365672429685 | 0.586 |
| -0.7448248565373223 | 0.166 |
| 0.14964437171761347 | 0.957 |
| 0.1669139760356959 | 0.08 |
| 0.3812279488273349 | 0.541 |
| -2.2805213477316584 | 0.128 |
| -1.2385280387564137 | 0.316 |
| -0.7851328293688722 | 0.793 |
| 1.2355140392634318 | 0.151 |
| 0.6214042978963397 | 0.963 |
| 0.8433143720269154 | 0.755 |
| 0.3809135094898428 | 0.539 |
| -0.8940039857137236 | 0.727 |
| 0.6761488549377468 | 0.734 |
| 0.09555425464829614 | 0.427 |
| 0.3738523225181023 | 0.698 |
| -2.008680060543292 | 0.628 |
| 1.345953631953364 | 0.777 |
| 0.0557487144087041 | 0.267 |
| 0.1613565040723719 | 0.391 |
| -0.5351518988016135 | 0.582 |
| 0.4387936427788608 | 0.638 |
| -0.6863051358462435 | 0.277 |
| 1.772812299167625 | 0.493 |
| 0.4408587201897891 | 0.255 |
| -2.1220386449162807 | 0.449 |
| -0.790232109203842 | 0.769 |
| 0.7182411132506834 | 0.625 |
| -0.00042976878610900826 | 0.938 |
| 0.23357926935812845 | 0.114 |
| 1.9336020080892329 | 0.119 |
| 0.5423996289660877 | 0.448 |
| 0.5251859886923969 | 0.556 |
| 0.11420013938587736 | 0.268 |
| 0.3008525574410488 | 0.301 |
| -0.0410691429494463 | 0.43 |
| 0.5817384029448558 | 0.757 |
| 1.2650957593325405 | 0.944 |
| 0.9813203146349396 | 0.307 |
| -0.7499360018776304 | 0.434 |
| 0.6216472484253472 | 0.314 |
| -0.00894727569688758 | 0.55 |
| -0.1339147961602647 | 0.994 |
| 0.7961610976535587 | 0.94 |
| 0.00827411274970391 | 0.264 |
| 0.6276137725355984 | 0.724 |
| -1.2999146423685692 | 0.208 |
| 0.44653851665292343 | 0.732 |
| 0.005385656815041884 | 0.011 |
| 0.6169455089393541 | 0.005 |
| -0.49539421281814455 | 0.799 |
| -0.3814230911923788 | 0.017 |
| -0.5877249405809533 | 0.544 |
| -1.1720976886338796 | 0.357 |
| 0.10106193753258896 | 0.649 |
| 0.1640460456938344 | 0.213 |
| -0.9155261170791071 | 0.161 |
| -2.0834924915011395 | 0.998 |
| 1.219972954082853 | 0.688 |
| 1.2090346180872737 | 0.977 |
| -0.5624525700392784 | 0.559 |
| 0.7487162982066504 | 0.511 |
| -1.0993426515514964 | 0.64 |
| 2.0435745949123874 | 0.295 |
| 0.6317329987186984 | 0.282 |
| -1.4315052585607502 | 0.548 |
| -1.3997988004925679 | 0.674 |
| -0.6802675859246206 | 0.622 |
| -0.5633209665342029 | 0.462 |
| -0.23452704300443905 | 0.387 |
| 0.492539011767418 | 0.355 |
| -0.6189000254750923 | 0.144 |
| 1.5108641034833044 | 0.471 |
| -0.8488975024927603 | 0.089 |
| -1.4440255697308828 | 0.369 |
| -0.2632812064567043 | 0.025 |
| -0.7188422904673537 | 0.893 |
| 0.47819631149396 | 0.383 |
| 0.7317805132846624 | 0.946 |
| -2.019012130659469 | 0.341 |
| -0.8125741096271923 | 0.883 |
| -1.3999477593269276 | 0.821 |
| -2.0330821790245306 | 0.694 |
| -0.3591024773333267 | 0.889 |
| 0.5527421505752823 | 0.258 |
| 0.26780480651688787 | 0.396 |
| 1.0732787191732749 | 0.366 |
| 0.5135833483766454 | 0.935 |
| -2.19046302953941 | 0.732 |
| -0.17522796374351746 | 0.491 |
| 1.5398080431836592 | 0.737 |
| -0.7715900305738606 | 0.811 |
| -1.3395273678361832 | 0.988 |
| -1.5314546505702022 | 0.934 |
| 0.5815807943295548 | 0.603 |
| 0.7610373321106314 | 0.639 |
| 1.2252706909869833 | 0.701 |
| -1.064931001053763 | 0.047 |
| -0.029946026934521086 | 0.282 |
| -0.08607398715582715 | 0.056 |
| -1.1695100045326026 | 0.825 |
| 1.919270074076186 | 0.512 |
| 1.3116063097290738 | 0.741 |
| 0.4504176939680553 | 0.42 |
| -1.0369267243170759 | 0.98 |
| 2.086782083796816 | 0.834 |
| -0.5405650023837953 | 0.81 |
| 0.6790514002146368 | 0.959 |
| 1.3343856513204244 | 0.028 |
| -1.0364890499188508 | 0.132 |
| -0.27736050466915163 | 0.882 |
| -0.4234564895290598 | 0.678 |
| -1.6269308317504318 | 0.579 |
| -0.28126137373885385 | 0.155 |
| -0.24543749757261146 | 0.744 |
| 0.4901302815115427 | 0.822 |
| 0.5225346651994975 | 0.699 |
| 0.1741645892140964 | 0.993 |
| -1.3314550740912532 | 0.928 |
| 1.4053792985870022 | 0.132 |
| 2.144038908135567 | 0.25 |
| -0.28461671641232034 | 0.81 |
| -1.4196350053609486 | 0.178 |
| -0.4572204786585621 | 0.554 |
| -0.19393554810820657 | 0.116 |
| 1.1485908119434187 | 0.467 |
| 2.0681241108328265 | 0.492 |
| 0.6237419287764032 | 0.458 |
| -0.08270213255247327 | 0.911 |
| -2.187487457886307 | 0.909 |
| 0.9758134360447688 | 0.231 |
| 0.4682388793335317 | 0.055 |
| 0.7421241569985035 | 0.22 |
| -1.3354109454096275 | 0.927 |